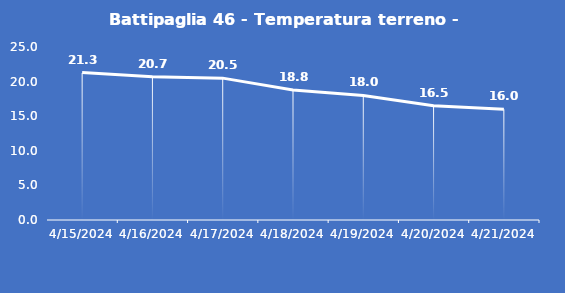
| Category | Battipaglia 46 - Temperatura terreno - Max (°C) |
|---|---|
| 4/15/24 | 21.3 |
| 4/16/24 | 20.7 |
| 4/17/24 | 20.5 |
| 4/18/24 | 18.8 |
| 4/19/24 | 18 |
| 4/20/24 | 16.5 |
| 4/21/24 | 16 |